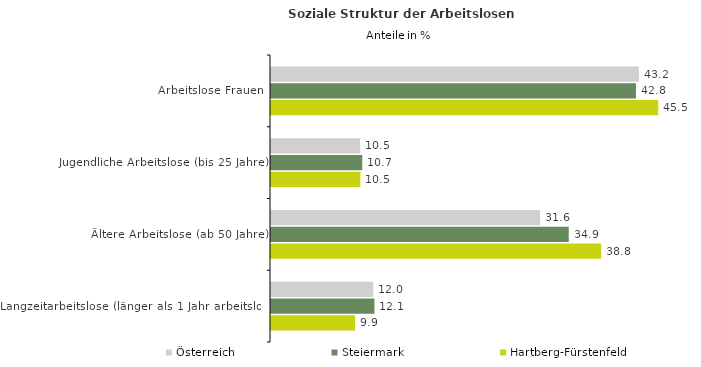
| Category | Österreich | Steiermark | Hartberg-Fürstenfeld |
|---|---|---|---|
| Arbeitslose Frauen | 43.18 | 42.833 | 45.455 |
| Jugendliche Arbeitslose (bis 25 Jahre) | 10.46 | 10.711 | 10.494 |
| Ältere Arbeitslose (ab 50 Jahre) | 31.584 | 34.947 | 38.753 |
| Langzeitarbeitslose (länger als 1 Jahr arbeitslos) | 11.999 | 12.142 | 9.87 |